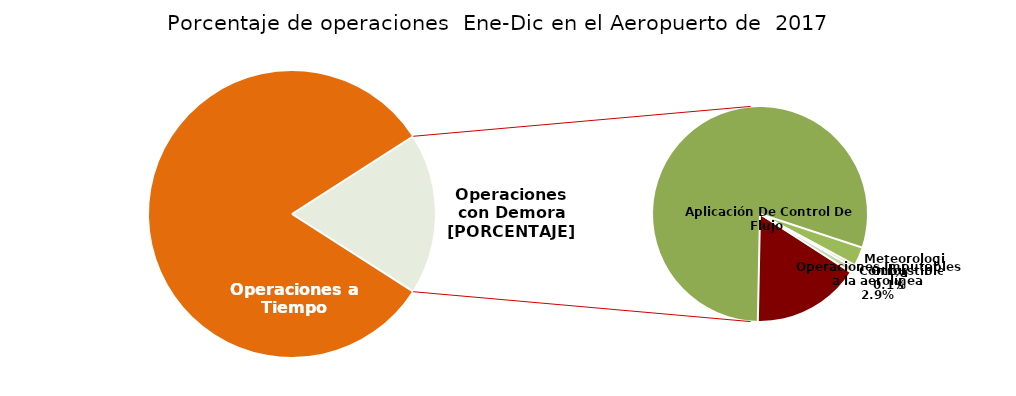
| Category | Series 0 |
|---|---|
| Operaciones a Tiempo | 4498 |
| Operaciones Imputables a la aerolínea | 162 |
| Aplicación De Control De Flujo  | 795 |
| Meteorologia | 28 |
| Combustibles | 4 |
| Otros | 8 |